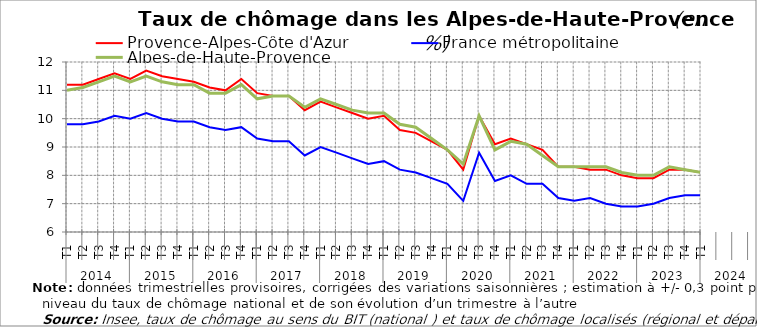
| Category | Provence-Alpes-Côte d'Azur | France métropolitaine | Alpes-de-Haute-Provence |
|---|---|---|---|
| 0 | 11.2 | 9.8 | 11 |
| 1 | 11.2 | 9.8 | 11.1 |
| 2 | 11.4 | 9.9 | 11.3 |
| 3 | 11.6 | 10.1 | 11.5 |
| 4 | 11.4 | 10 | 11.3 |
| 5 | 11.7 | 10.2 | 11.5 |
| 6 | 11.5 | 10 | 11.3 |
| 7 | 11.4 | 9.9 | 11.2 |
| 8 | 11.3 | 9.9 | 11.2 |
| 9 | 11.1 | 9.7 | 10.9 |
| 10 | 11 | 9.6 | 10.9 |
| 11 | 11.4 | 9.7 | 11.2 |
| 12 | 10.9 | 9.3 | 10.7 |
| 13 | 10.8 | 9.2 | 10.8 |
| 14 | 10.8 | 9.2 | 10.8 |
| 15 | 10.3 | 8.7 | 10.4 |
| 16 | 10.6 | 9 | 10.7 |
| 17 | 10.4 | 8.8 | 10.5 |
| 18 | 10.2 | 8.6 | 10.3 |
| 19 | 10 | 8.4 | 10.2 |
| 20 | 10.1 | 8.5 | 10.2 |
| 21 | 9.6 | 8.2 | 9.8 |
| 22 | 9.5 | 8.1 | 9.7 |
| 23 | 9.2 | 7.9 | 9.3 |
| 24 | 8.9 | 7.7 | 8.9 |
| 25 | 8.2 | 7.1 | 8.4 |
| 26 | 10.1 | 8.8 | 10.1 |
| 27 | 9.1 | 7.8 | 8.9 |
| 28 | 9.3 | 8 | 9.2 |
| 29 | 9.1 | 7.7 | 9.1 |
| 30 | 8.9 | 7.7 | 8.7 |
| 31 | 8.3 | 7.2 | 8.3 |
| 32 | 8.3 | 7.1 | 8.3 |
| 33 | 8.2 | 7.2 | 8.3 |
| 34 | 8.2 | 7 | 8.3 |
| 35 | 8 | 6.9 | 8.1 |
| 36 | 7.9 | 6.9 | 8 |
| 37 | 7.9 | 7 | 8 |
| 38 | 8.2 | 7.2 | 8.3 |
| 39 | 8.2 | 7.3 | 8.2 |
| 40 | 8.1 | 7.3 | 8.1 |